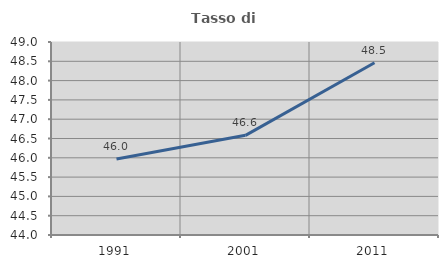
| Category | Tasso di occupazione   |
|---|---|
| 1991.0 | 45.968 |
| 2001.0 | 46.582 |
| 2011.0 | 48.462 |